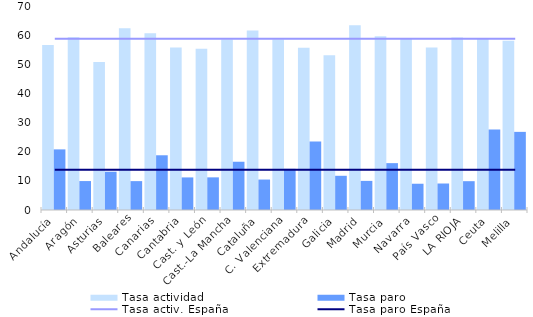
| Category | Tasa actividad | Tasa paro |
|---|---|---|
| Andalucía | 56.63 | 20.8 |
| Aragón | 59.31 | 9.93 |
| Asturias | 50.77 | 13.14 |
| Baleares | 62.37 | 9.91 |
| Canarias | 60.65 | 18.78 |
| Cantabria | 55.73 | 11.18 |
| Cast. y León | 55.33 | 11.2 |
| Cast.-La Mancha | 58.54 | 16.56 |
| Cataluña | 61.57 | 10.45 |
| C. Valenciana | 58.49 | 14.13 |
| Extremadura | 55.66 | 23.48 |
| Galicia | 53.13 | 11.74 |
| Madrid | 63.4 | 9.99 |
| Murcia | 59.64 | 16.08 |
| Navarra | 58.64 | 9.01 |
| País Vasco | 55.8 | 9.09 |
| LA RIOJA | 59.19 | 9.89 |
| Ceuta | 58.82 | 27.58 |
| Melilla | 58.08 | 26.81 |